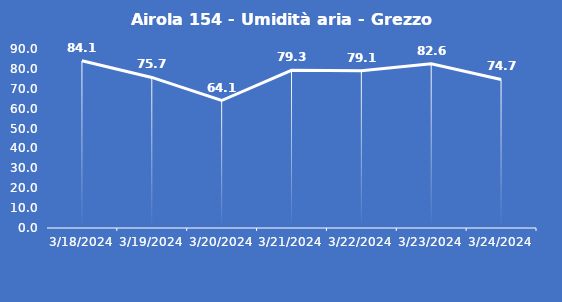
| Category | Airola 154 - Umidità aria - Grezzo (%) |
|---|---|
| 3/18/24 | 84.1 |
| 3/19/24 | 75.7 |
| 3/20/24 | 64.1 |
| 3/21/24 | 79.3 |
| 3/22/24 | 79.1 |
| 3/23/24 | 82.6 |
| 3/24/24 | 74.7 |